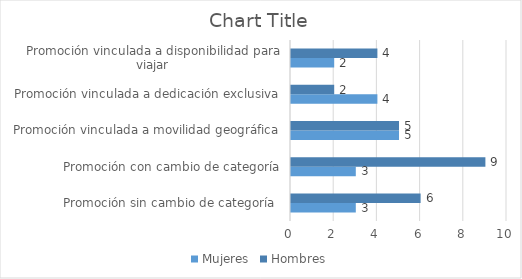
| Category | Mujeres | Hombres |
|---|---|---|
| Promoción sin cambio de categoría  | 3 | 6 |
| Promoción con cambio de categoría | 3 | 9 |
| Promoción vinculada a movilidad geográfica | 5 | 5 |
| Promoción vinculada a dedicación exclusiva | 4 | 2 |
| Promoción vinculada a disponibilidad para viajar | 2 | 4 |